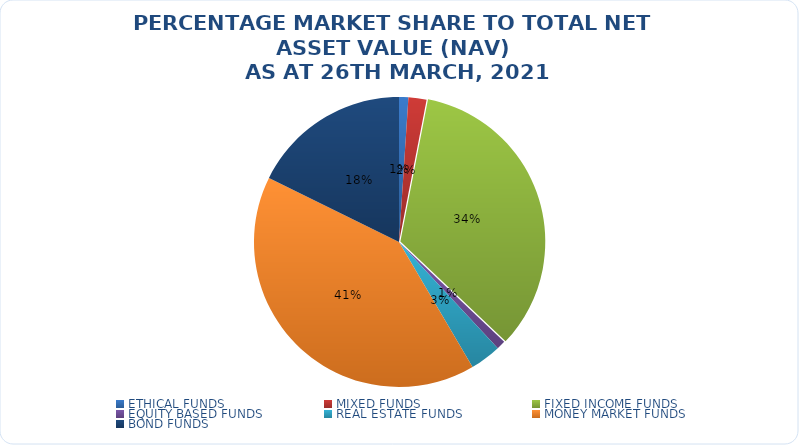
| Category | NET ASSET VALUE |
|---|---|
| ETHICAL FUNDS | 14992221203.59 |
| MIXED FUNDS | 29055441454.75 |
| FIXED INCOME FUNDS | 491300167905.053 |
| EQUITY BASED FUNDS | 14337562231.48 |
| REAL ESTATE FUNDS | 49985369807.951 |
| MONEY MARKET FUNDS | 588293220080.653 |
| BOND FUNDS | 255664320314.9 |